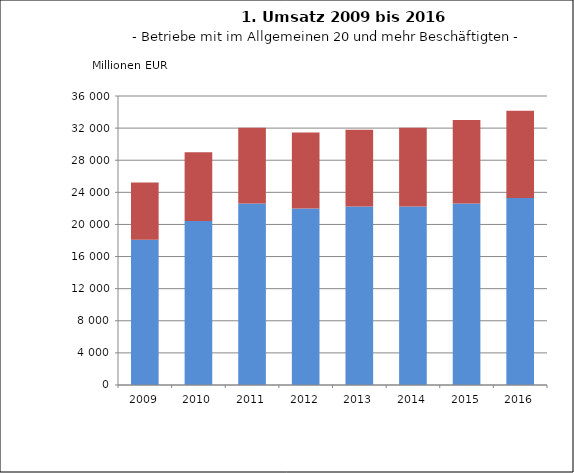
| Category | Inland umsatz | Ausland umsatz |
|---|---|---|
| 2009.0 | 18103.931 | 7111.569 |
| 2010.0 | 20440.329 | 8560.204 |
| 2011.0 | 22606.685 | 9451.682 |
| 2012.0 | 21971.623 | 9490.007 |
| 2013.0 | 22235.95 | 9555.079 |
| 2014.0 | 22238.159 | 9816.082 |
| 2015.0 | 22613.676 | 10383.052 |
| 2016.0 | 23301.648 | 10851.594 |